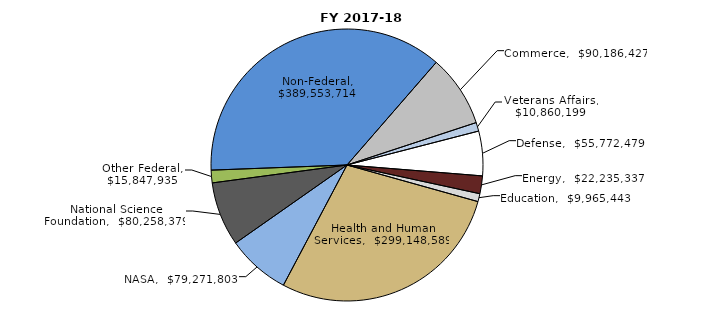
| Category | Series 0 |
|---|---|
| Commerce | 90186427 |
| Veterans Affairs | 10860199 |
| Defense | 55772479 |
| Energy | 22235337 |
| Education | 9965443 |
| Health and Human Services | 299148589 |
| NASA | 79271803 |
| National Science Foundation | 80258379 |
| Other Federal | 15847935 |
| Non-Federal | 389553713.86 |